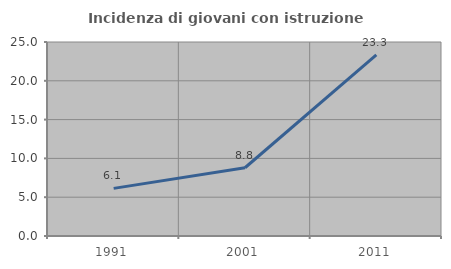
| Category | Incidenza di giovani con istruzione universitaria |
|---|---|
| 1991.0 | 6.135 |
| 2001.0 | 8.796 |
| 2011.0 | 23.333 |